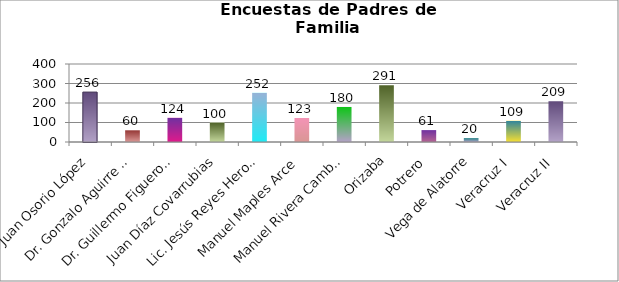
| Category | Series 1 |
|---|---|
| Don Juan Osorio López | 256 |
| Dr. Gonzalo Aguirre Beltrán | 60 |
| Dr. Guillermo Figueroa Cárdenas | 124 |
| Juan Díaz Covarrubias | 100 |
| Lic. Jesús Reyes Heroles | 252 |
| Manuel Maples Arce | 123 |
| Manuel Rivera Cambas | 180 |
| Orizaba | 291 |
| Potrero | 61 |
| Vega de Alatorre | 20 |
| Veracruz I | 109 |
| Veracruz II | 209 |